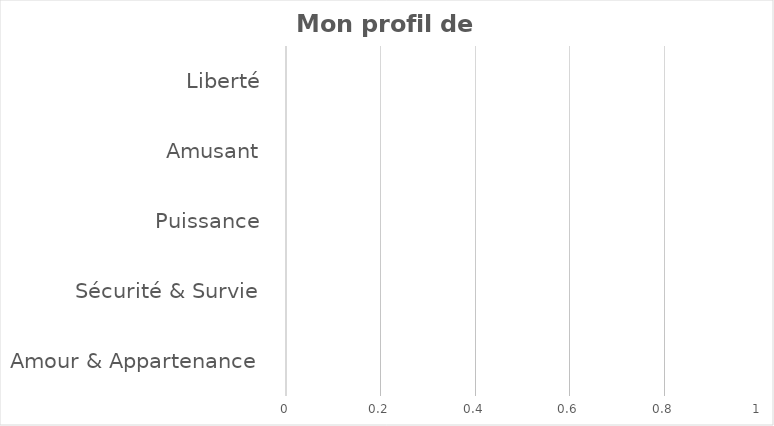
| Category | Series 0 |
|---|---|
| Amour & Appartenance | 0 |
| Sécurité & Survie | 0 |
| Puissance | 0 |
| Amusant | 0 |
| Liberté | 0 |